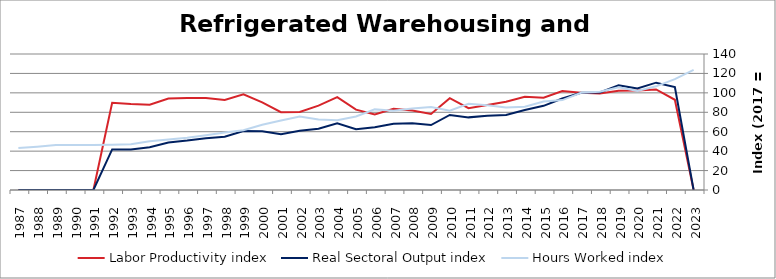
| Category | Labor Productivity index | Real Sectoral Output index | Hours Worked index |
|---|---|---|---|
| 2023.0 | 0 | 0 | 123.624 |
| 2022.0 | 92.901 | 105.983 | 114.082 |
| 2021.0 | 103.544 | 110.488 | 106.706 |
| 2020.0 | 102.479 | 104.411 | 101.885 |
| 2019.0 | 102.044 | 107.794 | 105.635 |
| 2018.0 | 99.293 | 100.417 | 101.132 |
| 2017.0 | 100 | 100 | 100 |
| 2016.0 | 101.795 | 94.248 | 92.586 |
| 2015.0 | 95.026 | 86.649 | 91.184 |
| 2014.0 | 96.062 | 82.409 | 85.788 |
| 2013.0 | 90.887 | 77.141 | 84.876 |
| 2012.0 | 87.558 | 76.453 | 87.317 |
| 2011.0 | 84.261 | 74.766 | 88.732 |
| 2010.0 | 94.575 | 77.248 | 81.68 |
| 2009.0 | 78.294 | 66.863 | 85.4 |
| 2008.0 | 81.719 | 68.635 | 83.99 |
| 2007.0 | 83.718 | 68.245 | 81.518 |
| 2006.0 | 77.817 | 64.575 | 82.983 |
| 2005.0 | 82.734 | 62.653 | 75.728 |
| 2004.0 | 95.615 | 68.66 | 71.809 |
| 2003.0 | 86.83 | 62.998 | 72.553 |
| 2002.0 | 80.417 | 60.895 | 75.725 |
| 2001.0 | 80.141 | 57.327 | 71.533 |
| 2000.0 | 90.136 | 60.584 | 67.214 |
| 1999.0 | 98.493 | 60.666 | 61.594 |
| 1998.0 | 92.753 | 54.845 | 59.13 |
| 1997.0 | 94.732 | 53.361 | 56.329 |
| 1996.0 | 94.769 | 50.883 | 53.692 |
| 1995.0 | 94.147 | 48.873 | 51.911 |
| 1994.0 | 87.777 | 43.985 | 50.11 |
| 1993.0 | 88.476 | 41.689 | 47.119 |
| 1992.0 | 89.869 | 41.751 | 46.458 |
| 1991.0 | 0 | 0 | 46.217 |
| 1990.0 | 0 | 0 | 46.232 |
| 1989.0 | 0 | 0 | 46.325 |
| 1988.0 | 0 | 0 | 44.615 |
| 1987.0 | 0 | 0 | 43.207 |